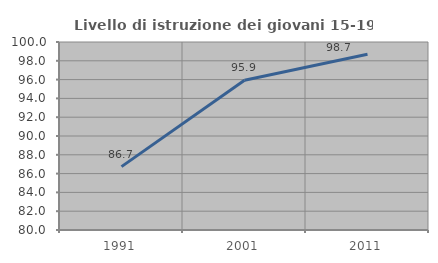
| Category | Livello di istruzione dei giovani 15-19 anni |
|---|---|
| 1991.0 | 86.74 |
| 2001.0 | 95.921 |
| 2011.0 | 98.701 |